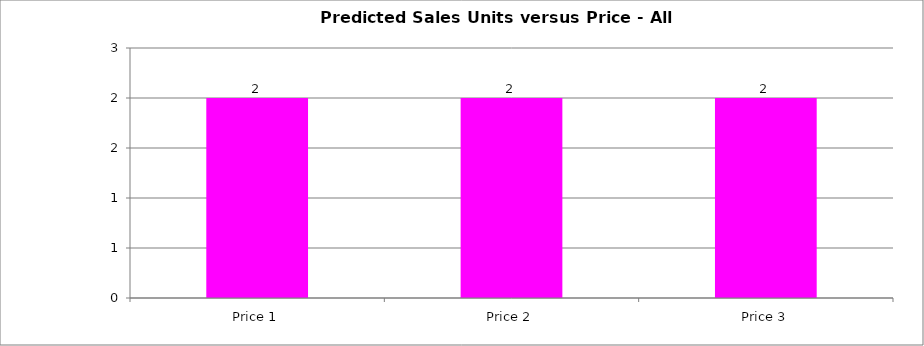
| Category | Predicted Sales Units |
|---|---|
| Price 1 | 2 |
| Price 2 | 2 |
| Price 3 | 2 |